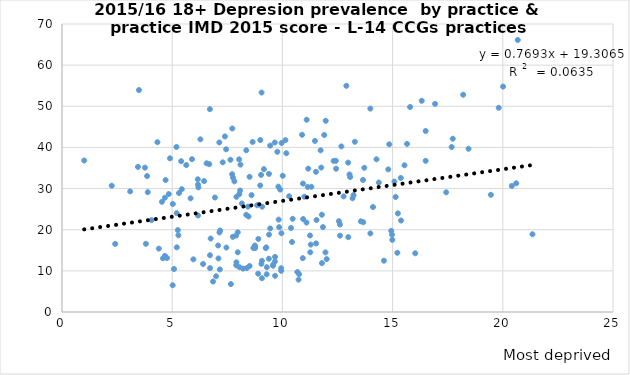
| Category | IMD2015 score |
|---|---|
| 7.914628724 | 27.992 |
| 5.434782609 | 29.86 |
| 19.457013575 | 28.486 |
| 7.823029593 | 31.752 |
| 6.161490683 | 32.262 |
| 10.996252746 | 28.016 |
| 6.188801217 | 30.281 |
| 9.394572025 | 18.811 |
| 11.477180664 | 41.58 |
| 7.719682453 | 33.495 |
| 9.082568807 | 25.589 |
| 7.292340885 | 36.378 |
| 4.900133156 | 37.358 |
| 8.359497645 | 23.619 |
| 6.68161435 | 35.94 |
| 3.446925186 | 35.269 |
| 10.17935046 | 38.583 |
| 8.160042116 | 26.392 |
| 6.279683377 | 41.968 |
| 11.100447857 | 46.731 |
| 4.668125456 | 27.769 |
| 6.168549088 | 30.964 |
| 8.64995958 | 41.321 |
| 17.730216396 | 42.119 |
| 3.763294246 | 35.086 |
| 14.269819193 | 37.122 |
| 15.793304221 | 49.823 |
| 9.054910243 | 53.34 |
| 13.989343612 | 49.43 |
| 20.011422045 | 54.792 |
| 12.901342674 | 54.976 |
| 15.539959897 | 35.662 |
| 16.322559723 | 51.334 |
| 14.849142181 | 40.757 |
| 10.014317531 | 33.112 |
| 13.558769164 | 22.039 |
| 11.761612621 | 35.104 |
| 13.715710723 | 35.052 |
| 11.094349973 | 21.742 |
| 18.202886337 | 52.807 |
| 13.286713287 | 41.373 |
| 12.983300737 | 36.308 |
| 9.817307692 | 30.475 |
| 8.037094281 | 37.101 |
| 16.926503341 | 50.576 |
| 9.901993917 | 29.746 |
| 20.609318996 | 31.287 |
| 12.675296656 | 40.245 |
| 20.679357969 | 66.116 |
| 10.759792355 | 9.198 |
| 6.745655608 | 17.859 |
| 15.3834916 | 22.239 |
| 13.667322537 | 21.829 |
| 7.145712572 | 19.33 |
| 12.609351433 | 21.259 |
| 10.436103276 | 17.013 |
| 9.245152355 | 15.522 |
| 7.973562087 | 14.51 |
| 14.973419965 | 18.795 |
| 9.8317387 | 22.453 |
| 11.794177387 | 11.881 |
| 9.387087176 | 12.95 |
| 9.285295841 | 9.167 |
| 7.160268129 | 10.345 |
| 20.407393436 | 30.63 |
| 8.68338558 | 15.563 |
| 21.347661923 | 18.894 |
| 15.214446953 | 14.395 |
| 9.945397816 | 10.004 |
| 5.021834061 | 6.501 |
| 13.227848101 | 28.405 |
| 9.071428571 | 8.212 |
| 11.54875717 | 22.347 |
| 6.853413109 | 7.402 |
| 11.954331766 | 14.485 |
| 12.989493792 | 18.198 |
| 6.714413608 | 13.802 |
| 10.46624575 | 22.655 |
| 11.530753815 | 16.67 |
| 12.613720187 | 18.546 |
| 2.413289932 | 16.553 |
| 5.898234683 | 37.139 |
| 6.991335524 | 8.695 |
| 17.681564246 | 40.098 |
| 10.932475884 | 31.215 |
| 13.656946205 | 32.095 |
| 7.446221732 | 39.547 |
| 14.375444418 | 31.469 |
| 7.39117733 | 42.668 |
| 11.150087697 | 30.392 |
| 6.445115811 | 31.816 |
| 6.173829378 | 23.454 |
| 7.752174577 | 18.273 |
| 7.099265164 | 13.024 |
| 8.045126688 | 28.664 |
| 5.255255255 | 19.904 |
| 11.791542376 | 23.64 |
| 9.388946104 | 33.566 |
| 5.280118989 | 18.653 |
| 4.763563529 | 13.126 |
| 11.73380035 | 39.295 |
| 4.064607739 | 22.323 |
| 8.361434175 | 39.304 |
| 4.843473125 | 28.664 |
| 5.028476177 | 26.254 |
| 12.776412776 | 28.092 |
| 9.446606139 | 40.438 |
| 4.699927693 | 32.067 |
| 9.655172414 | 41.196 |
| 9.770202405 | 38.94 |
| 12.437534703 | 34.829 |
| 8.097165992 | 35.812 |
| 10.138113429 | 41.77 |
| 11.965607834 | 46.471 |
| 13.045977011 | 33.433 |
| 8.462332301 | 23.21 |
| 12.425056853 | 36.748 |
| 8.081002893 | 29.522 |
| 5.208333333 | 15.716 |
| 8.509861213 | 32.861 |
| 4.535147392 | 26.782 |
| 5.203503349 | 24.024 |
| 6.938325991 | 27.829 |
| 9.031936128 | 33.321 |
| 8.996088657 | 41.793 |
| 8.85408824 | 25.943 |
| 4.329681794 | 41.272 |
| 14.98620901 | 17.539 |
| 5.192761605 | 40.112 |
| 10.306122449 | 28.128 |
| 7.642124884 | 36.999 |
| 15.138653084 | 27.952 |
| 3.493449782 | 53.949 |
| 4.394387001 | 15.41 |
| 9.160649819 | 34.716 |
| 6.710743802 | 49.304 |
| 12.325711099 | 36.719 |
| 13.073908175 | 32.81 |
| 9.665551839 | 13.388 |
| 9.667547642 | 8.795 |
| 7.66407119 | 6.776 |
| 11.17223868 | 34.84 |
| 8.389095415 | 10.677 |
| 7.914248872 | 12.08 |
| 9.956505295 | 19.144 |
| 10.892586989 | 43.07 |
| 11.897810219 | 43.025 |
| 13.991658819 | 19.096 |
| 8.216953556 | 10.561 |
| 15.239532252 | 23.968 |
| 9.446861405 | 20.315 |
| 1.007556675 | 36.824 |
| 14.110058456 | 25.515 |
| 8.4375 | 25.615 |
| 16.027531957 | 14.274 |
| 16.50025385 | 43.996 |
| 9.581646424 | 11.514 |
| 5.637903653 | 35.723 |
| 10.390214718 | 20.42 |
| 2.256186317 | 30.689 |
| 13.182886695 | 27.642 |
| 5.309139785 | 28.917 |
| 7.75950668 | 32.627 |
| 5.081669691 | 10.453 |
| 10.942649967 | 22.589 |
| 19.81544439 | 49.637 |
| 14.938451909 | 19.717 |
| 3.861256545 | 33.038 |
| 5.407407407 | 36.648 |
| 15.654688145 | 40.857 |
| 8.599651365 | 28.406 |
| 12.563391063 | 22.076 |
| 6.715103479 | 10.664 |
| 7.9 | 18.575 |
| 11.253357207 | 18.594 |
| 9.66132199 | 12.278 |
| 8.908377568 | 17.757 |
| 8.749424758 | 16.161 |
| 8.995093585 | 30.759 |
| 15.372378886 | 32.577 |
| 11.314984709 | 30.435 |
| 8.048323975 | 10.895 |
| 14.804029592 | 34.661 |
| 9.071759584 | 12.444 |
| 9.964230966 | 41.078 |
| 6.400898372 | 11.668 |
| 8.5123437 | 11.18 |
| 8.754266212 | 15.843 |
| 10.733863837 | 7.863 |
| 17.432354634 | 29.089 |
| 7.137907138 | 41.212 |
| 5.833738454 | 27.625 |
| 4.6692607 | 13.642 |
| 9.29350403 | 10.886 |
| 15.081024569 | 31.707 |
| 7.727008149 | 44.605 |
| 5.960828839 | 12.798 |
| 4.578034682 | 13.056 |
| 8.900410456 | 9.326 |
| 10.677966102 | 9.717 |
| 7.084309133 | 16.166 |
| 8.733031674 | 15.613 |
| 3.092783505 | 29.308 |
| 9.851654622 | 20.614 |
| 3.891708968 | 29.128 |
| 7.973473165 | 19.372 |
| 11.264544176 | 14.509 |
| 9.943590311 | 10.644 |
| 8.760628704 | 15.549 |
| 11.524594386 | 34.066 |
| 7.459059694 | 15.667 |
| 18.444883939 | 39.676 |
| 12.008486563 | 12.86 |
| 14.606609432 | 12.476 |
| 11.286992429 | 16.383 |
| 9.049023222 | 11.711 |
| 7.174979558 | 19.798 |
| 9.574594146 | 11.243 |
| 7.904934126 | 11.354 |
| 11.841100076 | 20.637 |
| 16.499162479 | 36.744 |
| 6.561514196 | 36.146 |
| 3.805620609 | 16.571 |
| 9.268060837 | 15.699 |
| 10.924981792 | 13.088 |